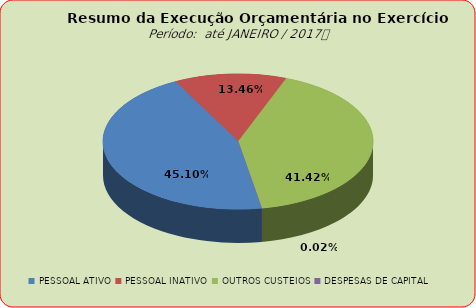
| Category | Series 0 |
|---|---|
| PESSOAL ATIVO | 15471250.65 |
| PESSOAL INATIVO | 4615930.23 |
| OUTROS CUSTEIOS | 14210146.35 |
| DESPESAS DE CAPITAL | 6197 |